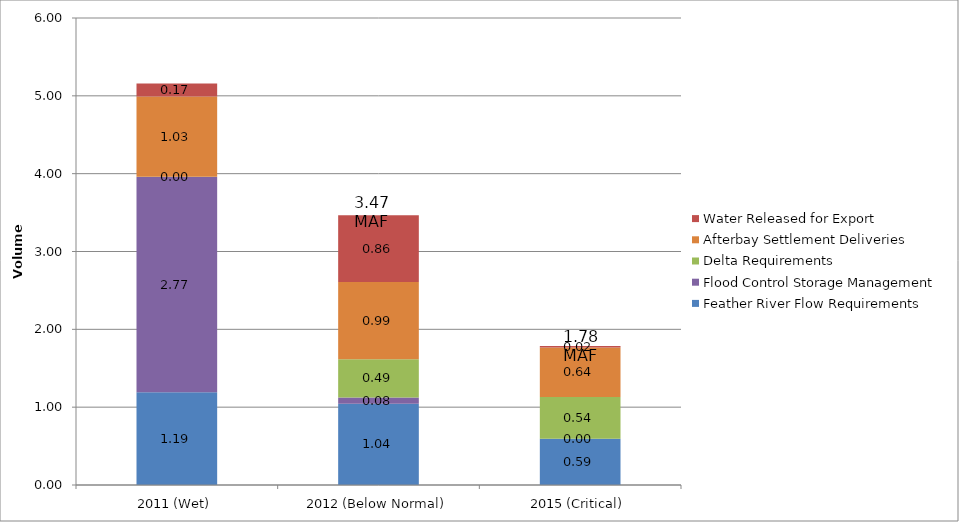
| Category | Feather River Flow Requirements | Flood Control Storage Management | Delta Requirements | Afterbay Settlement Deliveries | Water Released for Export |
|---|---|---|---|---|---|
| 2011 (Wet) | 1.19 | 2.767 | 0.004 | 1.03 | 0.167 |
| 2012 (Below Normal) | 1.042 | 0.083 | 0.491 | 0.994 | 0.856 |
| 2015 (Critical) | 0.594 | 0 | 0.537 | 0.635 | 0.019 |